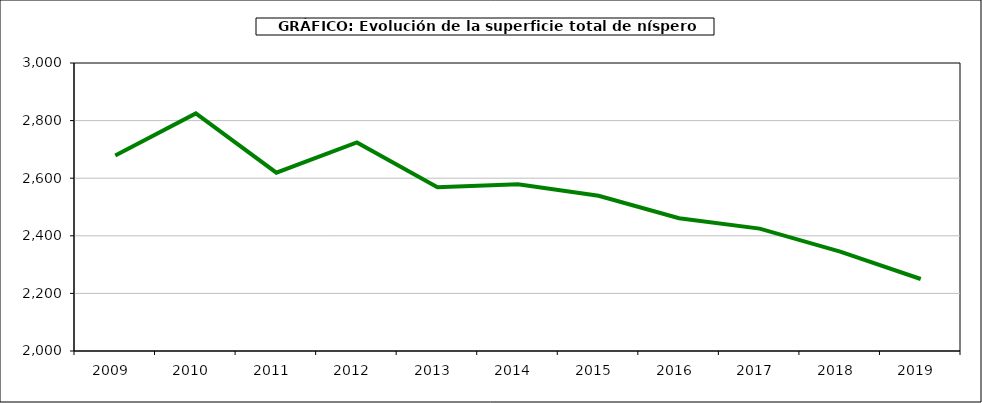
| Category | superficie níspero |
|---|---|
| 2009.0 | 2679 |
| 2010.0 | 2825 |
| 2011.0 | 2619 |
| 2012.0 | 2724 |
| 2013.0 | 2569 |
| 2014.0 | 2579 |
| 2015.0 | 2539 |
| 2016.0 | 2461 |
| 2017.0 | 2425 |
| 2018.0 | 2345 |
| 2019.0 | 2250 |